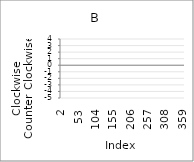
| Category | Series 0 |
|---|---|
| 2.0 | 3 |
| 3.0 | 2 |
| 4.0 | 1 |
| 5.0 | -5 |
| 6.0 | -4 |
| 7.0 | 4 |
| 8.0 | 2 |
| 9.0 | -2 |
| 10.0 | 1 |
| 11.0 | -2 |
| 12.0 | 0 |
| 13.0 | 3 |
| 14.0 | -3 |
| 15.0 | 4 |
| 16.0 | 4 |
| 17.0 | -1 |
| 18.0 | -4 |
| 19.0 | 0 |
| 20.0 | 4 |
| 21.0 | 0 |
| 22.0 | 0 |
| 23.0 | -3 |
| 24.0 | 1 |
| 25.0 | -1 |
| 26.0 | -2 |
| 27.0 | -5 |
| 28.0 | -3 |
| 29.0 | 2 |
| 30.0 | -1 |
| 31.0 | -5 |
| 32.0 | 4 |
| 33.0 | 1 |
| 34.0 | 3 |
| 35.0 | -3 |
| 36.0 | 3 |
| 37.0 | 0 |
| 38.0 | 4 |
| 39.0 | -5 |
| 40.0 | 2 |
| 41.0 | -4 |
| 42.0 | 0 |
| 43.0 | 4 |
| 44.0 | 4 |
| 45.0 | -4 |
| 46.0 | -4 |
| 47.0 | 0 |
| 48.0 | -3 |
| 49.0 | -5 |
| 50.0 | -1 |
| 51.0 | -3 |
| 52.0 | 4 |
| 53.0 | 2 |
| 54.0 | -5 |
| 55.0 | -2 |
| 56.0 | 3 |
| 57.0 | 0 |
| 58.0 | 2 |
| 59.0 | -3 |
| 60.0 | 1 |
| 61.0 | -1 |
| 62.0 | -1 |
| 63.0 | 4 |
| 64.0 | 2 |
| 65.0 | 1 |
| 66.0 | 2 |
| 67.0 | -1 |
| 68.0 | 2 |
| 69.0 | -1 |
| 70.0 | 4 |
| 71.0 | 2 |
| 72.0 | -4 |
| 73.0 | -1 |
| 74.0 | -2 |
| 75.0 | -4 |
| 76.0 | 3 |
| 77.0 | 0 |
| 78.0 | -5 |
| 79.0 | 0 |
| 80.0 | -1 |
| 81.0 | -3 |
| 82.0 | -2 |
| 83.0 | -2 |
| 84.0 | 3 |
| 85.0 | -1 |
| 86.0 | -4 |
| 87.0 | 0 |
| 88.0 | -1 |
| 89.0 | -5 |
| 90.0 | -4 |
| 91.0 | -2 |
| 92.0 | -2 |
| 93.0 | 0 |
| 94.0 | -1 |
| 95.0 | 0 |
| 96.0 | -2 |
| 97.0 | 3 |
| 98.0 | 1 |
| 99.0 | 3 |
| 100.0 | 2 |
| 101.0 | 0 |
| 102.0 | 4 |
| 103.0 | -2 |
| 104.0 | -1 |
| 105.0 | -2 |
| 106.0 | -2 |
| 107.0 | -3 |
| 108.0 | 2 |
| 109.0 | 1 |
| 110.0 | -5 |
| 111.0 | 1 |
| 112.0 | 4 |
| 113.0 | 2 |
| 114.0 | -4 |
| 115.0 | -4 |
| 116.0 | -4 |
| 117.0 | 2 |
| 118.0 | 1 |
| 119.0 | -5 |
| 120.0 | 0 |
| 121.0 | 2 |
| 122.0 | 3 |
| 123.0 | -5 |
| 124.0 | 0 |
| 125.0 | 4 |
| 126.0 | -4 |
| 127.0 | 3 |
| 128.0 | -1 |
| 129.0 | 3 |
| 130.0 | -5 |
| 131.0 | 2 |
| 132.0 | -2 |
| 133.0 | -2 |
| 134.0 | -4 |
| 135.0 | -4 |
| 136.0 | 4 |
| 137.0 | 4 |
| 138.0 | -3 |
| 139.0 | -5 |
| 140.0 | -2 |
| 141.0 | 1 |
| 142.0 | -3 |
| 143.0 | 4 |
| 144.0 | -2 |
| 145.0 | -2 |
| 146.0 | 2 |
| 147.0 | -4 |
| 148.0 | -3 |
| 149.0 | -4 |
| 150.0 | 1 |
| 151.0 | -4 |
| 152.0 | -5 |
| 153.0 | -1 |
| 154.0 | 3 |
| 155.0 | 1 |
| 156.0 | 2 |
| 157.0 | 4 |
| 158.0 | -1 |
| 159.0 | -1 |
| 160.0 | -3 |
| 161.0 | 2 |
| 162.0 | -2 |
| 163.0 | 0 |
| 164.0 | 2 |
| 165.0 | 3 |
| 166.0 | -4 |
| 167.0 | 4 |
| 168.0 | 2 |
| 169.0 | 2 |
| 170.0 | 3 |
| 171.0 | -2 |
| 172.0 | -4 |
| 173.0 | -3 |
| 174.0 | 1 |
| 175.0 | -4 |
| 176.0 | 2 |
| 177.0 | -4 |
| 178.0 | -5 |
| 179.0 | 4 |
| 180.0 | -5 |
| 181.0 | -1 |
| 182.0 | 4 |
| 183.0 | -3 |
| 184.0 | -5 |
| 185.0 | 2 |
| 186.0 | 4 |
| 187.0 | -4 |
| 188.0 | -3 |
| 189.0 | 3 |
| 190.0 | -2 |
| 191.0 | -2 |
| 192.0 | -4 |
| 193.0 | 2 |
| 194.0 | -4 |
| 195.0 | 3 |
| 196.0 | -5 |
| 197.0 | -3 |
| 198.0 | 3 |
| 199.0 | -5 |
| 200.0 | 4 |
| 201.0 | 3 |
| 202.0 | -4 |
| 203.0 | 0 |
| 204.0 | 4 |
| 205.0 | 4 |
| 206.0 | -1 |
| 207.0 | 1 |
| 208.0 | 3 |
| 209.0 | 1 |
| 210.0 | -3 |
| 211.0 | -5 |
| 212.0 | 2 |
| 213.0 | 2 |
| 214.0 | -2 |
| 215.0 | 4 |
| 216.0 | -2 |
| 217.0 | -5 |
| 218.0 | -1 |
| 219.0 | -4 |
| 220.0 | 4 |
| 221.0 | -4 |
| 222.0 | 3 |
| 223.0 | 4 |
| 224.0 | -2 |
| 225.0 | -4 |
| 226.0 | 1 |
| 227.0 | -5 |
| 228.0 | -3 |
| 229.0 | 4 |
| 230.0 | -5 |
| 231.0 | 2 |
| 232.0 | 2 |
| 233.0 | 2 |
| 234.0 | -2 |
| 235.0 | -5 |
| 236.0 | 2 |
| 237.0 | 4 |
| 238.0 | -5 |
| 239.0 | -3 |
| 240.0 | 4 |
| 241.0 | 3 |
| 242.0 | -5 |
| 243.0 | 0 |
| 244.0 | 2 |
| 245.0 | -5 |
| 246.0 | -5 |
| 247.0 | -4 |
| 248.0 | -5 |
| 249.0 | -4 |
| 250.0 | -2 |
| 251.0 | -4 |
| 252.0 | -1 |
| 253.0 | 2 |
| 254.0 | -5 |
| 255.0 | 3 |
| 256.0 | -4 |
| 257.0 | 1 |
| 258.0 | -5 |
| 259.0 | 4 |
| 260.0 | 4 |
| 261.0 | 4 |
| 262.0 | -4 |
| 263.0 | -1 |
| 264.0 | 0 |
| 265.0 | 1 |
| 266.0 | -3 |
| 267.0 | 3 |
| 268.0 | 1 |
| 269.0 | 2 |
| 270.0 | -2 |
| 271.0 | -3 |
| 272.0 | 4 |
| 273.0 | 4 |
| 274.0 | 3 |
| 275.0 | 2 |
| 276.0 | -4 |
| 277.0 | -2 |
| 278.0 | -4 |
| 279.0 | -1 |
| 280.0 | 1 |
| 281.0 | -5 |
| 282.0 | -3 |
| 283.0 | -1 |
| 284.0 | 4 |
| 285.0 | -1 |
| 286.0 | -1 |
| 287.0 | 2 |
| 288.0 | -1 |
| 289.0 | 3 |
| 290.0 | -3 |
| 291.0 | 1 |
| 292.0 | -2 |
| 293.0 | 3 |
| 294.0 | 0 |
| 295.0 | 4 |
| 296.0 | -4 |
| 297.0 | 4 |
| 298.0 | 2 |
| 299.0 | -2 |
| 300.0 | 3 |
| 301.0 | 4 |
| 302.0 | -2 |
| 303.0 | 0 |
| 304.0 | -4 |
| 305.0 | 4 |
| 306.0 | -4 |
| 307.0 | -2 |
| 308.0 | -4 |
| 309.0 | 4 |
| 310.0 | 1 |
| 311.0 | 0 |
| 312.0 | -4 |
| 313.0 | -2 |
| 314.0 | -1 |
| 315.0 | 1 |
| 316.0 | -5 |
| 317.0 | 1 |
| 318.0 | -4 |
| 319.0 | -5 |
| 320.0 | 2 |
| 321.0 | 1 |
| 322.0 | -4 |
| 323.0 | -4 |
| 324.0 | -4 |
| 325.0 | 1 |
| 326.0 | -5 |
| 327.0 | 0 |
| 328.0 | -1 |
| 329.0 | -5 |
| 330.0 | -4 |
| 331.0 | 1 |
| 332.0 | 2 |
| 333.0 | 0 |
| 334.0 | -3 |
| 335.0 | -3 |
| 336.0 | -4 |
| 337.0 | 2 |
| 338.0 | -3 |
| 339.0 | 2 |
| 340.0 | -4 |
| 341.0 | 2 |
| 342.0 | 3 |
| 343.0 | 3 |
| 344.0 | 1 |
| 345.0 | 3 |
| 346.0 | -2 |
| 347.0 | 4 |
| 348.0 | 4 |
| 349.0 | 2 |
| 350.0 | 4 |
| 351.0 | 2 |
| 352.0 | -4 |
| 353.0 | 2 |
| 354.0 | 3 |
| 355.0 | -5 |
| 356.0 | 2 |
| 357.0 | 4 |
| 358.0 | 1 |
| 359.0 | -2 |
| 360.0 | 4 |
| 361.0 | -1 |
| 362.0 | -4 |
| 363.0 | -2 |
| 364.0 | 1 |
| 365.0 | -4 |